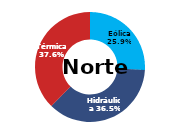
| Category | Norte |
|---|---|
| Eólica | 86.937 |
| Hidráulica | 122.56 |
| Solar | 0 |
| Térmica | 126.181 |